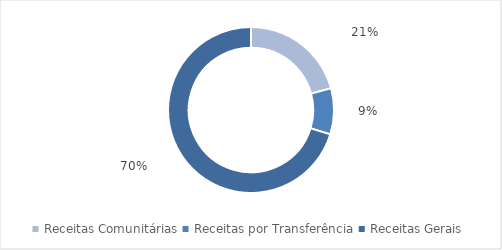
| Category | Series 0 |
|---|---|
| Receitas Comunitárias | 0.208 |
| Receitas por Transferência | 0.09 |
| Receitas Gerais | 0.703 |